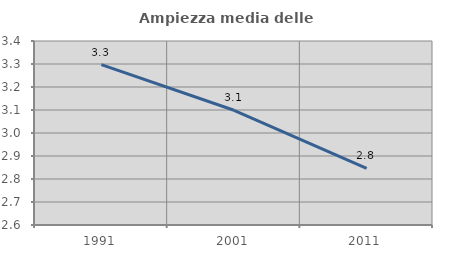
| Category | Ampiezza media delle famiglie |
|---|---|
| 1991.0 | 3.297 |
| 2001.0 | 3.099 |
| 2011.0 | 2.846 |